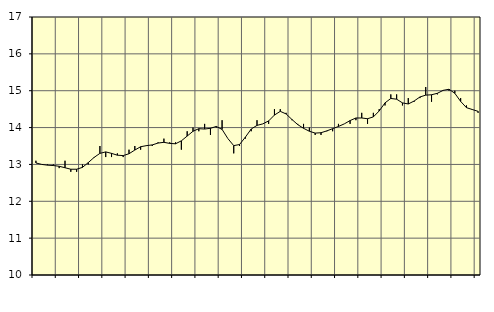
| Category | Piggar | Handel, SNI 45-47 |
|---|---|---|
| nan | 13.1 | 13.04 |
| 1.0 | 13 | 13 |
| 1.0 | 13 | 12.98 |
| 1.0 | 13 | 12.97 |
| nan | 12.9 | 12.95 |
| 2.0 | 13.1 | 12.91 |
| 2.0 | 12.8 | 12.87 |
| 2.0 | 12.8 | 12.87 |
| nan | 13 | 12.92 |
| 3.0 | 13 | 13.05 |
| 3.0 | 13.2 | 13.19 |
| 3.0 | 13.5 | 13.3 |
| nan | 13.2 | 13.34 |
| 4.0 | 13.2 | 13.3 |
| 4.0 | 13.3 | 13.25 |
| 4.0 | 13.2 | 13.24 |
| nan | 13.4 | 13.29 |
| 5.0 | 13.5 | 13.39 |
| 5.0 | 13.4 | 13.48 |
| 5.0 | 13.5 | 13.51 |
| nan | 13.5 | 13.53 |
| 6.0 | 13.6 | 13.58 |
| 6.0 | 13.7 | 13.6 |
| 6.0 | 13.6 | 13.57 |
| nan | 13.6 | 13.56 |
| 7.0 | 13.4 | 13.64 |
| 7.0 | 13.9 | 13.77 |
| 7.0 | 14 | 13.9 |
| nan | 13.9 | 13.97 |
| 8.0 | 14.1 | 13.96 |
| 8.0 | 13.8 | 13.98 |
| 8.0 | 14 | 14.03 |
| nan | 14.2 | 13.95 |
| 9.0 | 13.7 | 13.7 |
| 9.0 | 13.3 | 13.51 |
| 9.0 | 13.5 | 13.54 |
| nan | 13.7 | 13.74 |
| 10.0 | 13.9 | 13.96 |
| 10.0 | 14.2 | 14.06 |
| 10.0 | 14.1 | 14.1 |
| nan | 14.1 | 14.18 |
| 11.0 | 14.5 | 14.34 |
| 11.0 | 14.5 | 14.44 |
| 11.0 | 14.4 | 14.37 |
| nan | 14.2 | 14.22 |
| 12.0 | 14.1 | 14.08 |
| 12.0 | 14.1 | 13.98 |
| 12.0 | 14 | 13.9 |
| nan | 13.8 | 13.85 |
| 13.0 | 13.8 | 13.86 |
| 13.0 | 13.9 | 13.91 |
| 13.0 | 13.9 | 13.97 |
| nan | 14.1 | 14.03 |
| 14.0 | 14.1 | 14.1 |
| 14.0 | 14.1 | 14.19 |
| 14.0 | 14.2 | 14.26 |
| nan | 14.4 | 14.26 |
| 15.0 | 14.1 | 14.24 |
| 15.0 | 14.4 | 14.29 |
| 15.0 | 14.5 | 14.45 |
| nan | 14.6 | 14.67 |
| 16.0 | 14.9 | 14.79 |
| 16.0 | 14.9 | 14.77 |
| 16.0 | 14.6 | 14.67 |
| nan | 14.8 | 14.64 |
| 17.0 | 14.7 | 14.72 |
| 17.0 | 14.8 | 14.83 |
| 17.0 | 15.1 | 14.88 |
| nan | 14.7 | 14.89 |
| 18.0 | 14.9 | 14.93 |
| 18.0 | 15 | 15.01 |
| 18.0 | 15 | 15.04 |
| nan | 15 | 14.93 |
| 19.0 | 14.8 | 14.71 |
| 19.0 | 14.6 | 14.54 |
| 19.0 | 14.5 | 14.49 |
| nan | 14.4 | 14.44 |